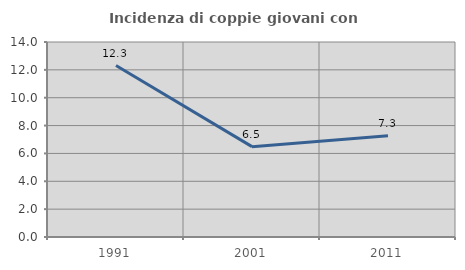
| Category | Incidenza di coppie giovani con figli |
|---|---|
| 1991.0 | 12.308 |
| 2001.0 | 6.486 |
| 2011.0 | 7.273 |